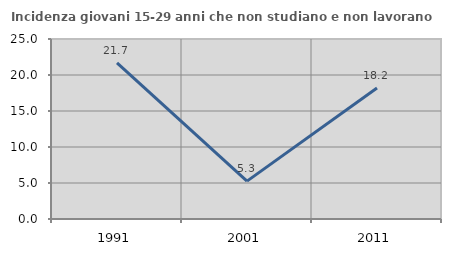
| Category | Incidenza giovani 15-29 anni che non studiano e non lavorano  |
|---|---|
| 1991.0 | 21.676 |
| 2001.0 | 5.263 |
| 2011.0 | 18.182 |